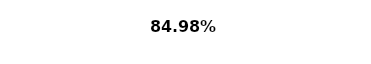
| Category | Series 0 |
|---|---|
| 0 | 0.85 |